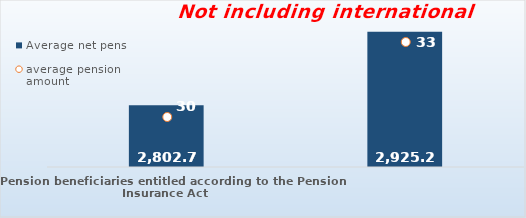
| Category | Average net pension  |
|---|---|
| Pension beneficiaries entitled according to the Pension Insurance Act   | 2802.72 |
| Pension beneficiaries entitled to pension FOR THE FIRST TIME in 2019 according to the Pension Insurance Act  - NEW BENEFICIARIES | 2925.213 |